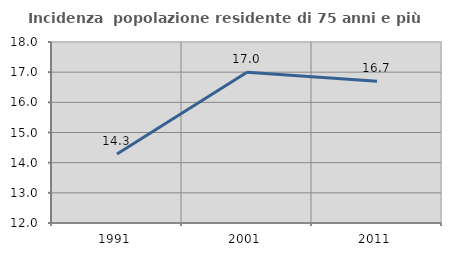
| Category | Incidenza  popolazione residente di 75 anni e più |
|---|---|
| 1991.0 | 14.289 |
| 2001.0 | 16.999 |
| 2011.0 | 16.696 |